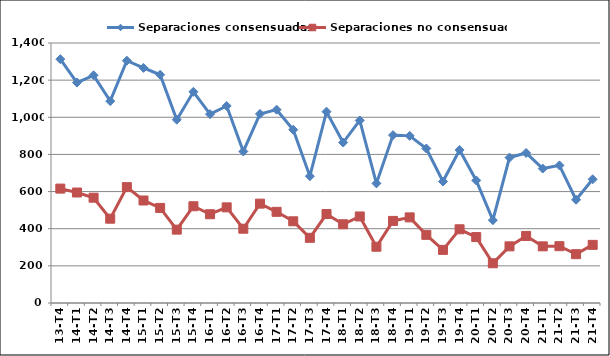
| Category | Separaciones consensuadas | Separaciones no consensuadas |
|---|---|---|
| 13-T4 | 1313 | 616 |
| 14-T1 | 1187 | 595 |
| 14-T2 | 1226 | 567 |
| 14-T3 | 1087 | 454 |
| 14-T4 | 1305 | 624 |
| 15-T1 | 1266 | 552 |
| 15-T2 | 1229 | 512 |
| 15-T3 | 987 | 395 |
| 15-T4 | 1137 | 521 |
| 16-T1 | 1017 | 478 |
| 16-T2 | 1061 | 515 |
| 16-T3 | 816 | 400 |
| 16-T4 | 1018 | 535 |
| 17-T1 | 1041 | 491 |
| 17-T2 | 933 | 440 |
| 17-T3 | 683 | 351 |
| 17-T4 | 1030 | 479 |
| 18-T1 | 864 | 424 |
| 18-T2 | 983 | 466 |
| 18-T3 | 644 | 303 |
| 18-T4 | 904 | 442 |
| 19-T1 | 900 | 461 |
| 19-T2 | 832 | 367 |
| 19-T3 | 654 | 286 |
| 19-T4 | 824 | 397 |
| 20-T1 | 660 | 355 |
| 20-T2 | 446 | 214 |
| 20-T3 | 783 | 305 |
| 20-T4 | 808 | 361 |
| 21-T1 | 724 | 305 |
| 21-T2 | 741 | 306 |
| 21-T3 | 556 | 263 |
| 21-T4 | 666 | 313 |